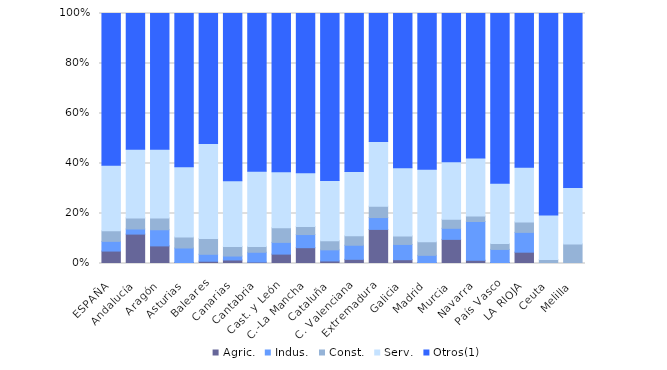
| Category | Agric. | Indus. | Const. | Serv. | Otros(1) |
|---|---|---|---|---|---|
| ESPAÑA | 4.973 | 3.886 | 4.194 | 26.218 | 60.731 |
| Andalucía | 11.765 | 2.035 | 4.428 | 27.434 | 54.338 |
| Aragón | 7.042 | 6.462 | 4.722 | 27.506 | 54.35 |
| Asturias | 0.407 | 5.793 | 4.37 | 28.15 | 61.28 |
| Baleares | 0.898 | 2.783 | 6.284 | 38.061 | 51.975 |
| Canarias | 1.403 | 1.578 | 3.857 | 26.213 | 66.949 |
| Cantabria | 0.586 | 3.906 | 2.344 | 30.078 | 63.086 |
| Cast. y León | 3.756 | 4.695 | 5.847 | 22.45 | 63.295 |
| C.-La Mancha | 6.323 | 5.263 | 3.25 | 21.512 | 63.652 |
| Cataluña | 1.018 | 4.442 | 3.688 | 24.085 | 66.768 |
| C. Valenciana | 1.668 | 5.638 | 3.758 | 25.711 | 63.224 |
| Extremadura | 13.636 | 4.743 | 4.545 | 25.889 | 51.186 |
| Galicia | 1.516 | 6.103 | 3.412 | 27.255 | 61.713 |
| Madrid | 0.376 | 2.891 | 5.455 | 29.022 | 62.257 |
| Murcia | 9.65 | 4.418 | 3.606 | 23.007 | 59.269 |
| Navarra | 1.293 | 15.517 | 2.155 | 23.276 | 57.759 |
| País Vasco | 0.402 | 5.227 | 2.355 | 24.067 | 67.949 |
| LA RIOJA | 4.545 | 7.955 | 4.167 | 21.97 | 61.742 |
| Ceuta | 0 | 0 | 1.562 | 17.969 | 81.25 |
| Melilla | 0 | 0 | 7.921 | 22.772 | 70.297 |